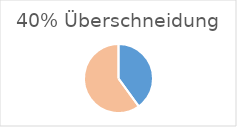
| Category | Series 0 |
|---|---|
| 0 | 40 |
| 1 | 60 |